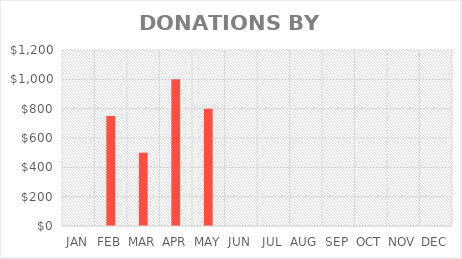
| Category | Donation |
|---|---|
| JAN | 0 |
| FEB | 750 |
| MAR | 500 |
| APR | 1000 |
| MAY | 800 |
| JUN | 0 |
| JUL | 0 |
| AUG | 0 |
| SEP | 0 |
| OCT | 0 |
| NOV | 0 |
| DEC | 0 |